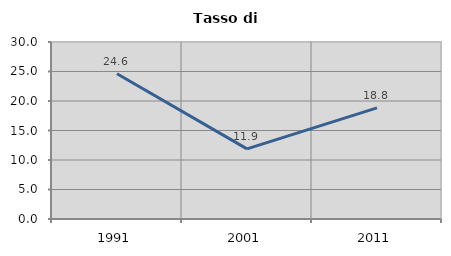
| Category | Tasso di disoccupazione   |
|---|---|
| 1991.0 | 24.619 |
| 2001.0 | 11.893 |
| 2011.0 | 18.831 |